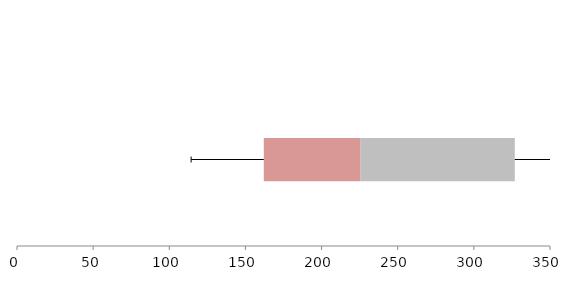
| Category | Series 1 | Series 2 | Series 3 |
|---|---|---|---|
| 0 | 162.06 | 63.579 | 101.252 |